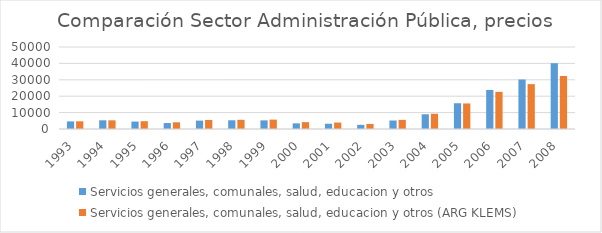
| Category | Servicios generales, comunales, salud, educacion y otros | Servicios generales, comunales, salud, educacion y otros (ARG KLEMS) |
|---|---|---|
| 1993.0 | 4641.862 | 4702.81 |
| 1994.0 | 5301.935 | 5297.28 |
| 1995.0 | 4532.757 | 4752.009 |
| 1996.0 | 3628.505 | 4080.973 |
| 1997.0 | 5118.918 | 5511.07 |
| 1998.0 | 5323.399 | 5598.973 |
| 1999.0 | 5268.448 | 5718.571 |
| 2000.0 | 3432.504 | 4175.54 |
| 2001.0 | 3209.752 | 3943.212 |
| 2002.0 | 2543.235 | 3089.465 |
| 2003.0 | 5181.12 | 5554.459 |
| 2004.0 | 8973.091 | 9285.244 |
| 2005.0 | 15713.435 | 15571.635 |
| 2006.0 | 23819.229 | 22647.89 |
| 2007.0 | 30168.782 | 27356.208 |
| 2008.0 | 40113.279 | 32338.698 |